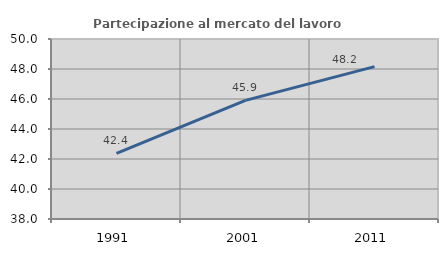
| Category | Partecipazione al mercato del lavoro  femminile |
|---|---|
| 1991.0 | 42.38 |
| 2001.0 | 45.908 |
| 2011.0 | 48.156 |